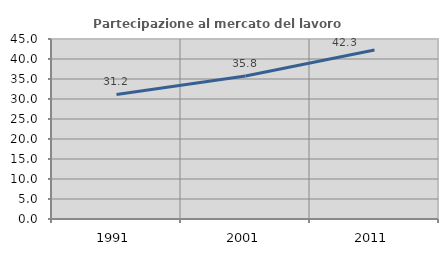
| Category | Partecipazione al mercato del lavoro  femminile |
|---|---|
| 1991.0 | 31.151 |
| 2001.0 | 35.762 |
| 2011.0 | 42.271 |